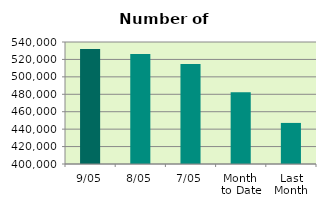
| Category | Series 0 |
|---|---|
| 9/05 | 532072 |
| 8/05 | 526254 |
| 7/05 | 514788 |
| Month 
to Date | 482258.333 |
| Last
Month | 447135.9 |